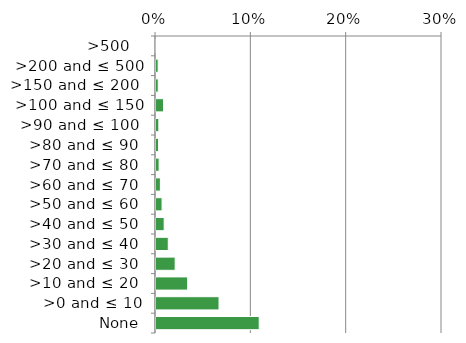
| Category | Non native |
|---|---|
|  None | 0.109 |
| >0 and ≤ 10 | 0.067 |
| >10 and ≤ 20  | 0.034 |
| >20 and ≤ 30  | 0.021 |
| >30 and ≤ 40  | 0.014 |
| >40 and ≤ 50  | 0.01 |
| >50 and ≤ 60  | 0.007 |
| >60 and ≤ 70  | 0.006 |
| >70 and ≤ 80  | 0.004 |
| >80 and ≤ 90  | 0.004 |
| >90 and ≤ 100  | 0.004 |
| >100 and ≤ 150 | 0.009 |
| >150 and ≤ 200  | 0.003 |
| >200 and ≤ 500 | 0.003 |
| >500   | 0 |